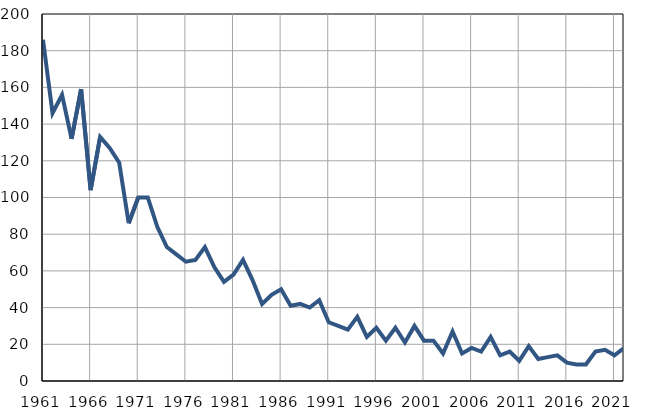
| Category | Infants
deaths |
|---|---|
| 1961.0 | 186 |
| 1962.0 | 146 |
| 1963.0 | 156 |
| 1964.0 | 132 |
| 1965.0 | 159 |
| 1966.0 | 104 |
| 1967.0 | 133 |
| 1968.0 | 127 |
| 1969.0 | 119 |
| 1970.0 | 86 |
| 1971.0 | 100 |
| 1972.0 | 100 |
| 1973.0 | 84 |
| 1974.0 | 73 |
| 1975.0 | 69 |
| 1976.0 | 65 |
| 1977.0 | 66 |
| 1978.0 | 73 |
| 1979.0 | 62 |
| 1980.0 | 54 |
| 1981.0 | 58 |
| 1982.0 | 66 |
| 1983.0 | 55 |
| 1984.0 | 42 |
| 1985.0 | 47 |
| 1986.0 | 50 |
| 1987.0 | 41 |
| 1988.0 | 42 |
| 1989.0 | 40 |
| 1990.0 | 44 |
| 1991.0 | 32 |
| 1992.0 | 30 |
| 1993.0 | 28 |
| 1994.0 | 35 |
| 1995.0 | 24 |
| 1996.0 | 29 |
| 1997.0 | 22 |
| 1998.0 | 29 |
| 1999.0 | 21 |
| 2000.0 | 30 |
| 2001.0 | 22 |
| 2002.0 | 22 |
| 2003.0 | 15 |
| 2004.0 | 27 |
| 2005.0 | 15 |
| 2006.0 | 18 |
| 2007.0 | 16 |
| 2008.0 | 24 |
| 2009.0 | 14 |
| 2010.0 | 16 |
| 2011.0 | 11 |
| 2012.0 | 19 |
| 2013.0 | 12 |
| 2014.0 | 13 |
| 2015.0 | 14 |
| 2016.0 | 10 |
| 2017.0 | 9 |
| 2018.0 | 9 |
| 2019.0 | 16 |
| 2020.0 | 17 |
| 2021.0 | 14 |
| 2022.0 | 18 |